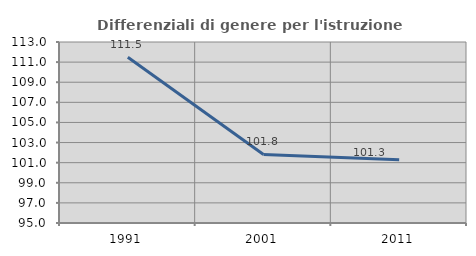
| Category | Differenziali di genere per l'istruzione superiore |
|---|---|
| 1991.0 | 111.482 |
| 2001.0 | 101.814 |
| 2011.0 | 101.298 |